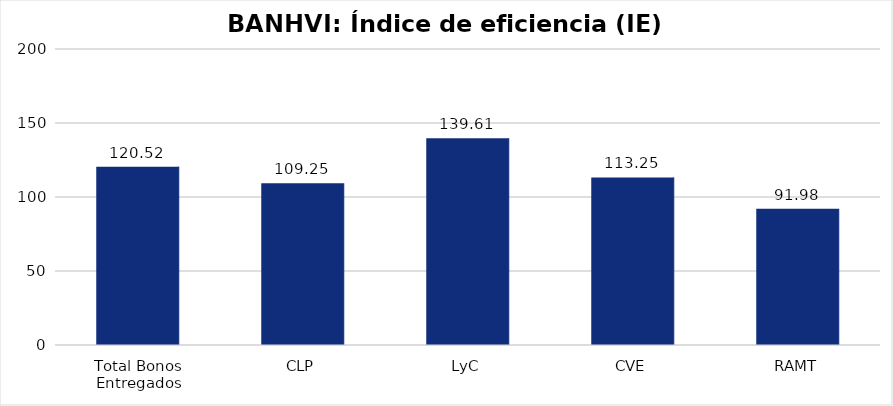
| Category | Índice de eficiencia (IE)  |
|---|---|
| Total Bonos Entregados | 120.52 |
| CLP | 109.246 |
| LyC | 139.613 |
| CVE | 113.248 |
| RAMT | 91.977 |